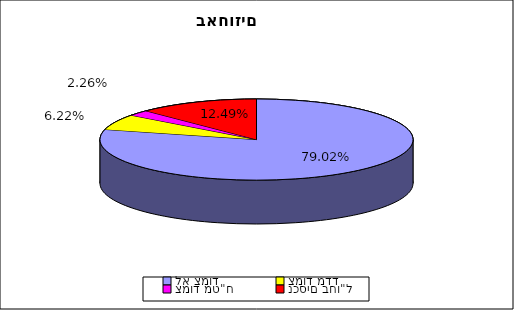
| Category | Series 0 |
|---|---|
| לא צמוד | 0.79 |
| צמוד מדד | 0.062 |
| צמוד מט"ח | 0.023 |
| נכסים בחו"ל | 0.125 |